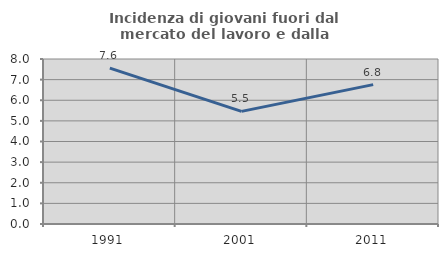
| Category | Incidenza di giovani fuori dal mercato del lavoro e dalla formazione  |
|---|---|
| 1991.0 | 7.561 |
| 2001.0 | 5.46 |
| 2011.0 | 6.757 |